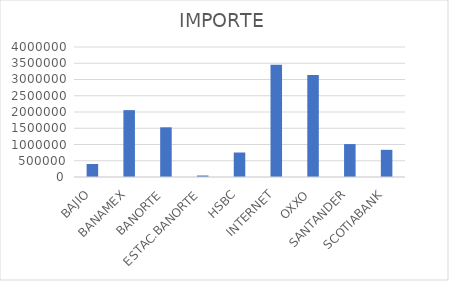
| Category | IMPORTE |
|---|---|
| BAJIO | 400095.48 |
| BANAMEX | 2057635.03 |
| BANORTE | 1529158.87 |
| ESTAC.BANORTE | 45825 |
| HSBC | 753523.21 |
| INTERNET | 3452283.44 |
| OXXO | 3142211.33 |
| SANTANDER | 1012915.69 |
| SCOTIABANK | 836155.69 |